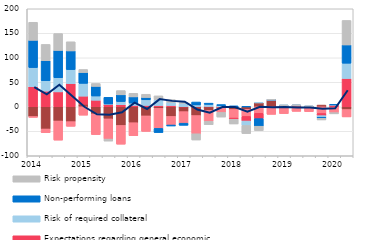
| Category | Costs of funding | Competition from other banks | Expectations regarding general economic situation | Risk of required collateral  | Non-performing loans  | Risk propensity |
|---|---|---|---|---|---|---|
| 2014.0 | -19.9 | -1.7 | 41 | 39.1 | 55.5 | 36.9 |
| nan | -45.3 | -7.7 | 31.9 | 21.4 | 40.8 | 33.2 |
| nan | -29 | -39.1 | 30.4 | 28.9 | 55.7 | 34.4 |
| nan | -30.3 | -9.6 | 47.3 | 28.6 | 38.1 | 18.7 |
| 2015.0 | 5.3 | -17.2 | 16.4 | 26.1 | 22.1 | 6.2 |
| nan | -14.5 | -42.3 | 13.3 | 8.7 | 19.6 | 6 |
| nan | -24.7 | -41.2 | 5.2 | 0.6 | 13.5 | -4.1 |
| nan | -38.1 | -38.3 | 4.2 | 6.5 | 13.7 | 8.7 |
| 2016.0 | -32.5 | -26.6 | 2.8 | 4.8 | 12.6 | 7.3 |
| nan | -18.6 | -31.7 | 2.8 | 11.4 | 4.8 | 6.6 |
| nan | -3.2 | -40.9 | 2.6 | 11.7 | -8.5 | 8 |
| nan | -19.7 | -17.5 | 2.6 | 6.4 | -2 | 5.6 |
| 2017.0 | -9.9 | -23.6 | 0.3 | 6.6 | -4.3 | 1.9 |
| nan | -17.9 | -37.2 | 0.4 | 3.4 | 5.9 | -12.7 |
| nan | -7.4 | -22.4 | 0.6 | 4.3 | 2.5 | -6.8 |
| nan | -2.2 | -9.3 | 0.1 | 2.2 | 2.2 | -9.5 |
| 2018.0 | -5.5 | -17.5 | -2.5 | 0 | 1.9 | -9.6 |
| nan | -5.2 | -14.4 | -9.5 | -9.1 | 0.3 | -16.5 |
| nan | 8.2 | -13.3 | -10.8 | 0.3 | -15.6 | -8.9 |
| nan | 13.5 | -15.5 | 0.1 | 0.3 | 0.3 | 0.1 |
| 2019.0 | 0 | -14 | 0.1 | 2.4 | 0.3 | 0.1 |
| nan | 2.3 | -9.4 | 0.1 | 0.3 | 0.3 | 0.1 |
| nan | 0 | -9.9 | 0.1 | 0.4 | 0.4 | 0.1 |
| nan | 3.5 | -13.7 | -4.4 | -3.2 | -2.2 | -3.4 |
| 2020.0 | 0 | -11.9 | 3.7 | 0.4 | 0.4 | -2.6 |
| nan | -5.6 | -15.1 | 57.7 | 31.2 | 37.3 | 50 |